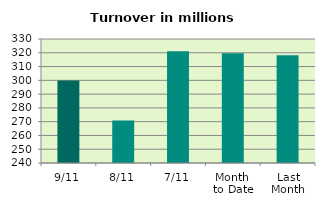
| Category | Series 0 |
|---|---|
| 9/11 | 299.924 |
| 8/11 | 270.757 |
| 7/11 | 321.032 |
| Month 
to Date | 319.697 |
| Last
Month | 318.176 |